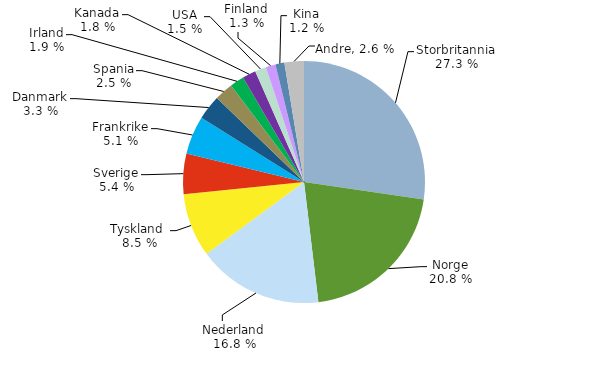
| Category | Series 0 |
|---|---|
| Storbritannia | 0.273 |
| Norge | 0.208 |
| Nederland | 0.168 |
| Tyskland  | 0.085 |
| Sverige | 0.054 |
| Frankrike | 0.051 |
| Danmark | 0.033 |
| Spania | 0.025 |
| Irland | 0.019 |
| Kanada | 0.018 |
| USA | 0.015 |
| Finland | 0.013 |
| Kina | 0.012 |
| Andre | 0.026 |